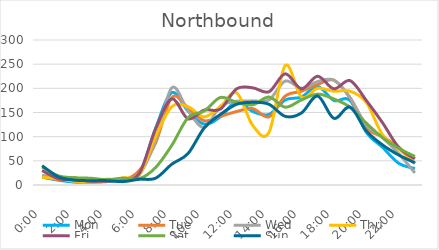
| Category | Mon | Tue | Wed | Thu | Fri | Sat | Sun |
|---|---|---|---|---|---|---|---|
| 0.0 | 16 | 19 | 20 | 16 | 30 | 37 | 40 |
| 0.041667 | 10 | 11 | 15 | 13 | 13 | 19 | 17 |
| 0.083333 | 6 | 15 | 7 | 8 | 11 | 15 | 10 |
| 0.125 | 6 | 5 | 6 | 6 | 8 | 14 | 9 |
| 0.166667 | 7 | 12 | 8 | 9 | 8 | 11 | 9 |
| 0.208333 | 12 | 10 | 13 | 15 | 11 | 14 | 7 |
| 0.25 | 23 | 30 | 22 | 21 | 24 | 13 | 12 |
| 0.291667 | 117 | 87 | 92 | 100 | 116 | 36 | 14 |
| 0.333333 | 191 | 181 | 201 | 162 | 178 | 82 | 43 |
| 0.375 | 153 | 160 | 154 | 162 | 137 | 139 | 65 |
| 0.416667 | 126 | 133 | 119 | 141 | 155 | 153 | 118 |
| 0.458333 | 141 | 142 | 163 | 162 | 157 | 181 | 146 |
| 0.5 | 173 | 152 | 173 | 191 | 199 | 171 | 167 |
| 0.541667 | 152 | 158 | 174 | 123 | 201 | 166 | 171 |
| 0.5833333333333334 | 146 | 141 | 176 | 109 | 193 | 182 | 167 |
| 0.625 | 176 | 184 | 215 | 247 | 230 | 161 | 142 |
| 0.666667 | 182 | 194 | 200 | 182 | 199 | 176 | 149 |
| 0.708333 | 204 | 208 | 214 | 200 | 225 | 188 | 184 |
| 0.75 | 175 | 217 | 217 | 194 | 199 | 178 | 138 |
| 0.791667 | 175 | 180 | 181 | 194 | 216 | 161 | 161 |
| 0.833333 | 109 | 118 | 124 | 171 | 175 | 128 | 112 |
| 0.875 | 78 | 100 | 98 | 104 | 129 | 98 | 83 |
| 0.916667 | 45 | 78 | 65 | 75 | 78 | 76 | 62 |
| 0.958333 | 34 | 44 | 25 | 45 | 54 | 59 | 46 |